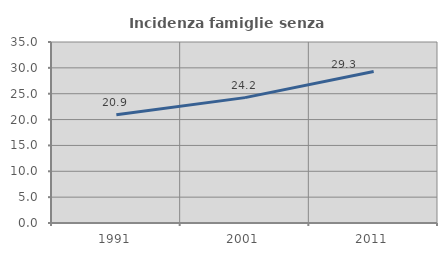
| Category | Incidenza famiglie senza nuclei |
|---|---|
| 1991.0 | 20.924 |
| 2001.0 | 24.242 |
| 2011.0 | 29.283 |